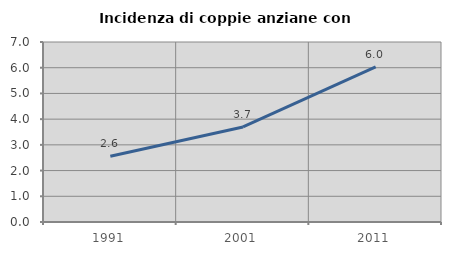
| Category | Incidenza di coppie anziane con figli |
|---|---|
| 1991.0 | 2.558 |
| 2001.0 | 3.696 |
| 2011.0 | 6.034 |